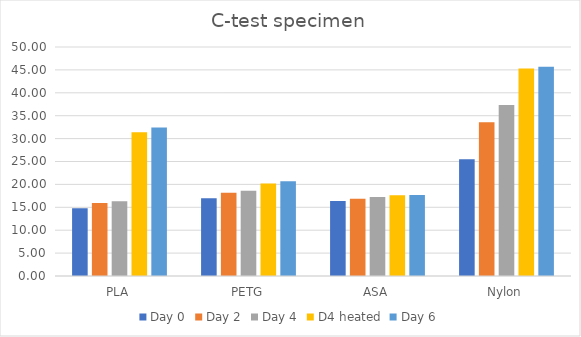
| Category | Day 0 | Day 2 | Day 4 | D4 heated | Day 6 |
|---|---|---|---|---|---|
| PLA | 14.79 | 15.95 | 16.3 | 31.4 | 32.41 |
| PETG | 17 | 18.2 | 18.6 | 20.22 | 20.67 |
| ASA | 16.36 | 16.87 | 17.24 | 17.63 | 17.69 |
| Nylon | 25.51 | 33.57 | 37.32 | 45.31 | 45.67 |